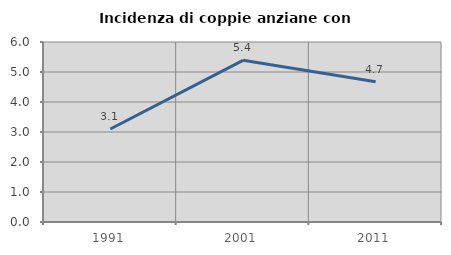
| Category | Incidenza di coppie anziane con figli |
|---|---|
| 1991.0 | 3.101 |
| 2001.0 | 5.389 |
| 2011.0 | 4.678 |